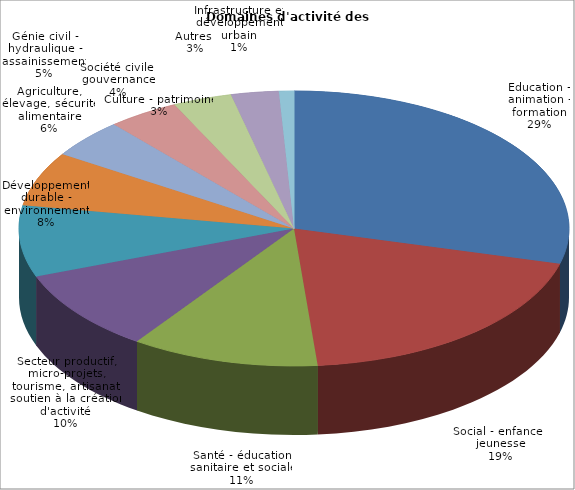
| Category | Nombre de volontaires | % |
|---|---|---|
| Education - animation - formation | 562 | 0.291 |
| Social - enfance - jeunesse | 376 | 0.195 |
| Santé - éducation sanitaire et sociale | 213 | 0.11 |
| Secteur productif, micro-projets, tourisme, artisanat, soutien à la création d'activité | 186 | 0.096 |
| Développement durable - environnement | 162 | 0.084 |
| Agriculture, élevage, sécurité alimentaire | 123 | 0.064 |
| Génie civil - hydraulique - assainissement | 88 | 0.046 |
| Société civile, gouvernance | 81 | 0.042 |
| Culture - patrimoine | 67 | 0.035 |
| Autres (décentralisation et maîtrise d'ouvrage, économie, organisation, logistique, mécanique, développement local et territorial…) | 54 | 0.028 |
| Infrastructure et développement urbain | 17 | 0.009 |